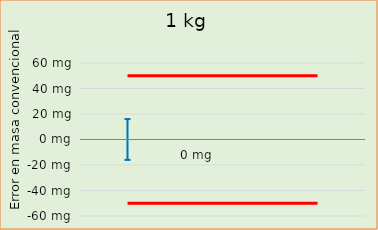
| Category | Error en masa convencional  |  ± EMP |
|---|---|---|
| 0 |  | -50 |
| 1 |  | -50 |
| 2 |  | -50 |